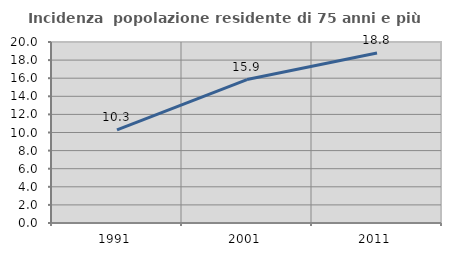
| Category | Incidenza  popolazione residente di 75 anni e più |
|---|---|
| 1991.0 | 10.281 |
| 2001.0 | 15.852 |
| 2011.0 | 18.78 |